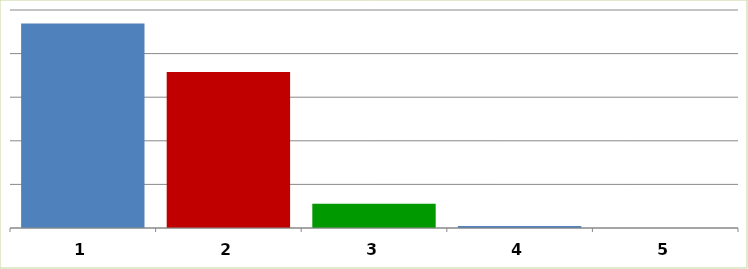
| Category | Series 0 |
|---|---|
| 0 | 23446927 |
| 1 | 17882434 |
| 2 | 2781304 |
| 3 | 224796 |
| 4 | 0 |